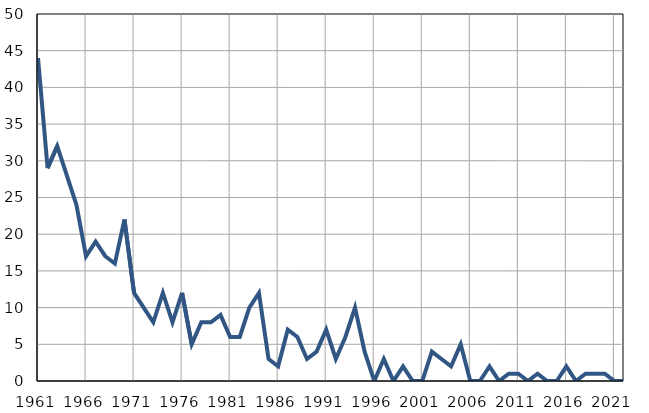
| Category | Infants
deaths |
|---|---|
| 1961.0 | 44 |
| 1962.0 | 29 |
| 1963.0 | 32 |
| 1964.0 | 28 |
| 1965.0 | 24 |
| 1966.0 | 17 |
| 1967.0 | 19 |
| 1968.0 | 17 |
| 1969.0 | 16 |
| 1970.0 | 22 |
| 1971.0 | 12 |
| 1972.0 | 10 |
| 1973.0 | 8 |
| 1974.0 | 12 |
| 1975.0 | 8 |
| 1976.0 | 12 |
| 1977.0 | 5 |
| 1978.0 | 8 |
| 1979.0 | 8 |
| 1980.0 | 9 |
| 1981.0 | 6 |
| 1982.0 | 6 |
| 1983.0 | 10 |
| 1984.0 | 12 |
| 1985.0 | 3 |
| 1986.0 | 2 |
| 1987.0 | 7 |
| 1988.0 | 6 |
| 1989.0 | 3 |
| 1990.0 | 4 |
| 1991.0 | 7 |
| 1992.0 | 3 |
| 1993.0 | 6 |
| 1994.0 | 10 |
| 1995.0 | 4 |
| 1996.0 | 0 |
| 1997.0 | 3 |
| 1998.0 | 0 |
| 1999.0 | 2 |
| 2000.0 | 0 |
| 2001.0 | 0 |
| 2002.0 | 4 |
| 2003.0 | 3 |
| 2004.0 | 2 |
| 2005.0 | 5 |
| 2006.0 | 0 |
| 2007.0 | 0 |
| 2008.0 | 2 |
| 2009.0 | 0 |
| 2010.0 | 1 |
| 2011.0 | 1 |
| 2012.0 | 0 |
| 2013.0 | 1 |
| 2014.0 | 0 |
| 2015.0 | 0 |
| 2016.0 | 2 |
| 2017.0 | 0 |
| 2018.0 | 1 |
| 2019.0 | 1 |
| 2020.0 | 1 |
| 2021.0 | 0 |
| 2022.0 | 0 |